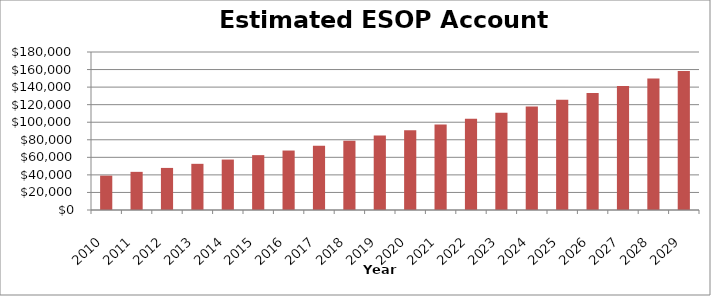
| Category | Year |
|---|---|
| 2010.0 | 39145.6 |
| 2011.0 | 43457.024 |
| 2012.0 | 47940.905 |
| 2013.0 | 52604.141 |
| 2014.0 | 57453.907 |
| 2015.0 | 62497.663 |
| 2016.0 | 67743.17 |
| 2017.0 | 73198.496 |
| 2018.0 | 78872.036 |
| 2019.0 | 84772.518 |
| 2020.0 | 90909.018 |
| 2021.0 | 97290.979 |
| 2022.0 | 103928.218 |
| 2023.0 | 110830.947 |
| 2024.0 | 118009.785 |
| 2025.0 | 125475.776 |
| 2026.0 | 133240.407 |
| 2027.0 | 141315.624 |
| 2028.0 | 149713.849 |
| 2029.0 | 158448.003 |